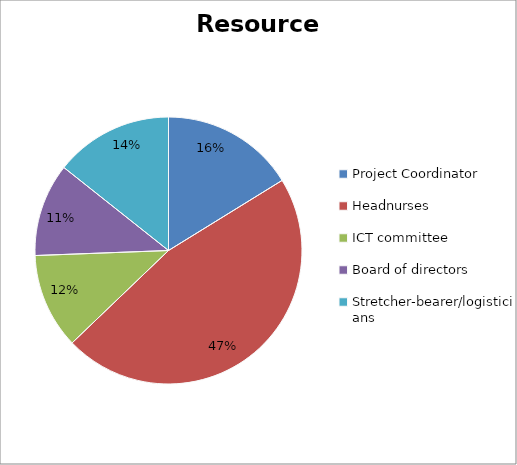
| Category | data |
|---|---|
| Project Coordinator | 16953.766 |
| Headnurses | 48796.801 |
| ICT committee | 12097.56 |
| Board of directors | 11799.002 |
| Stretcher-bearer/logisticians | 14992.32 |